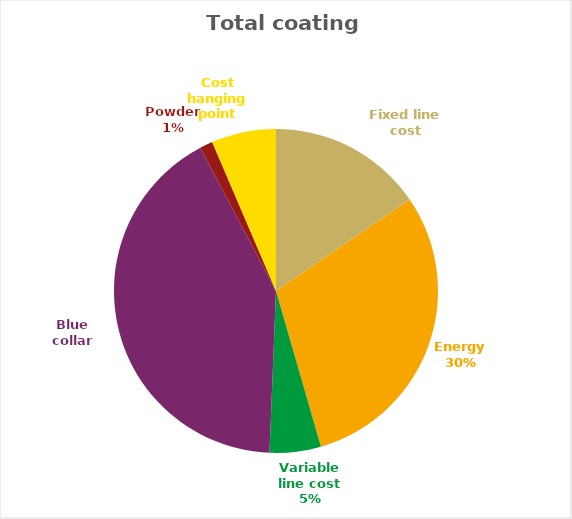
| Category | Series 0 | Series 1 |
|---|---|---|
| Fixed line cost | 0.012 | 0.155 |
| Energy | 0.023 | 0.301 |
| Variable line cost | 0.004 | 0.051 |
| Blue collar | 0.032 | 0.417 |
| Powder  | 0.001 | 0.013 |
| Cost hanging point | 0.005 | 0.065 |